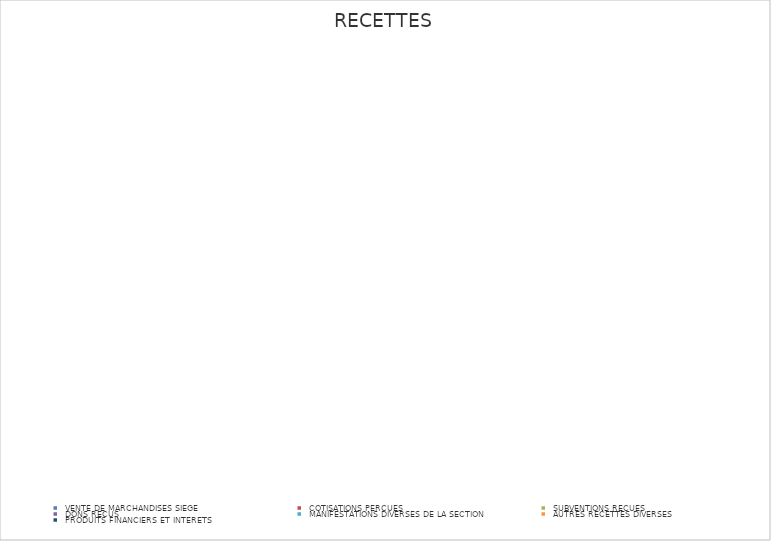
| Category | Series 0 |
|---|---|
|  VENTE DE MARCHANDISES SIEGE  | 0 |
|  COTISATIONS PERCUES  | 0 |
|  SUBVENTIONS RECUES  | 0 |
|  DONS RECUS  | 0 |
|  MANIFESTATIONS DIVERSES DE LA SECTION  | 0 |
|  AUTRES RECETTES DIVERSES  | 0 |
|  PRODUITS FINANCIERS ET INTERETS  | 0 |